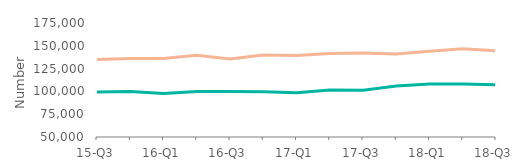
| Category | First-time
buyers | Home movers |
|---|---|---|
| 15-Q3 | 99295 | 135000 |
| 15-Q4 | 100000 | 135995 |
| 16-Q1 | 97752.5 | 136000 |
| 16-Q2 | 100000 | 139745 |
| 16-Q3 | 100000 | 135447.5 |
| 16-Q4 | 99750 | 140000 |
| 17-Q1 | 98500 | 139500 |
| 17-Q2 | 101598.5 | 141575 |
| 17-Q3 | 101250 | 142000 |
| 17-Q4 | 106000 | 140999 |
| 18-Q1 | 108000 | 143930 |
| 18-Q2 | 108000 | 146882 |
| 18-Q3 | 107350 | 144500 |